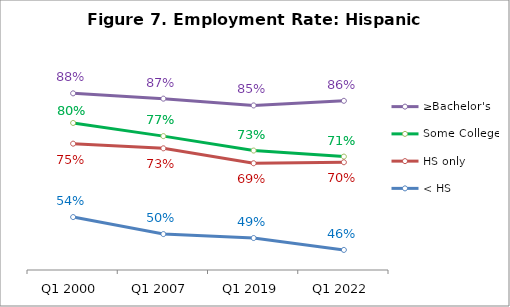
| Category | ≥Bachelor's | Some College | HS only | < HS |
|---|---|---|---|---|
| Q1 2000 | 0.884 | 0.803 | 0.746 | 0.545 |
| Q1 2007 | 0.869 | 0.767 | 0.733 | 0.498 |
| Q1 2019 | 0.851 | 0.727 | 0.692 | 0.488 |
| Q1 2022 | 0.864 | 0.711 | 0.695 | 0.455 |